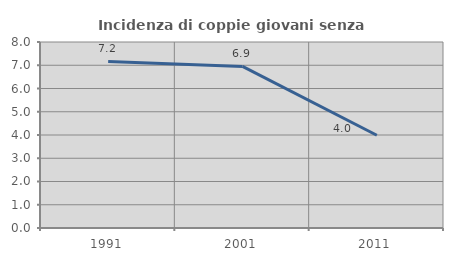
| Category | Incidenza di coppie giovani senza figli |
|---|---|
| 1991.0 | 7.164 |
| 2001.0 | 6.949 |
| 2011.0 | 3.988 |